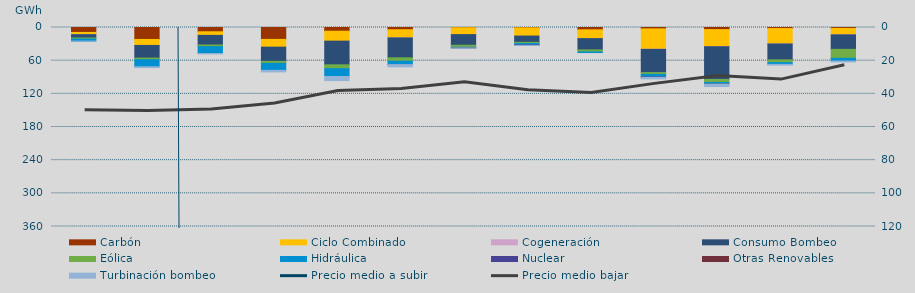
| Category | Carbón | Ciclo Combinado | Cogeneración | Consumo Bombeo | Eólica | Hidráulica | Nuclear | Otras Renovables | Turbinación bombeo |
|---|---|---|---|---|---|---|---|---|---|
| 0 | 8959.6 | 3990.4 | 71.2 | 5885.6 | 1996.4 | 3716.9 | 0 | 0 | 15 |
| 1 | 21604.2 | 10874.5 | 14.4 | 22855.5 | 2969.3 | 12705.9 | 0 | 0 | 1522.5 |
| 2 | 7773.2 | 6440.3 | 0 | 17414.3 | 3010.2 | 12467.7 | 0 | 0 | 569.8 |
| 3 | 21504.5 | 14043.2 | 0 | 25706.9 | 3674.1 | 12576.8 | 0 | 0 | 2844.7 |
| 4 | 6741.5 | 17945.7 | 0 | 42823.3 | 6982 | 14174.9 | 0 | 0 | 7355.5 |
| 5 | 4042.8 | 14771.1 | 31.2 | 36027.7 | 6028.8 | 6115.8 | 0 | 35 | 4115.2 |
| 6 | 433.4 | 12445.6 | 5 | 19266.6 | 3529.4 | 1301.2 | 0 | 5 | 693.9 |
| 7 | 569.3 | 14884.2 | 0 | 11390.5 | 2217.7 | 2414.5 | 870.6 | 0 | 88 |
| 8 | 4201.1 | 15848.6 | 69.7 | 20386.2 | 3745.6 | 1086.9 | 0 | 0 | 0 |
| 9 | 2463.3 | 36768.4 | 333.6 | 42011.2 | 3260.1 | 4994.6 | 253 | 107 | 2743.5 |
| 10 | 3814.9 | 30904.9 | 78.3 | 59133.4 | 5558 | 2931.3 | 0 | 36.2 | 4368.3 |
| 11 | 1862.6 | 27837.6 | 96.8 | 28735.2 | 5033.9 | 3139.3 | 0 | 0 | 1421.7 |
| 12 | 1673.1 | 11548.4 | 106.4 | 26206.5 | 16242.7 | 5014.4 | 0 | 0 | 1496.4 |